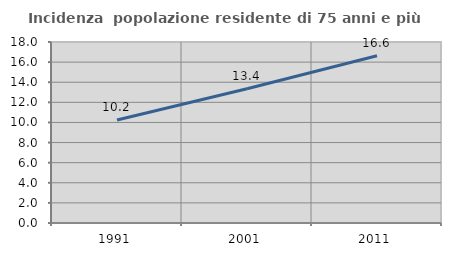
| Category | Incidenza  popolazione residente di 75 anni e più |
|---|---|
| 1991.0 | 10.246 |
| 2001.0 | 13.353 |
| 2011.0 | 16.631 |